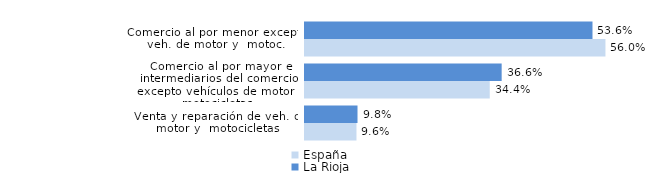
| Category | España | La Rioja |
|---|---|---|
| Venta y reparación de veh. de motor y  motocicletas | 0.096 | 0.098 |
| Comercio al por mayor e intermediarios del comercio, excepto vehículos de motor y motocicletas | 0.344 | 0.366 |
| Comercio al por menor excepto veh. de motor y  motoc. | 0.56 | 0.536 |